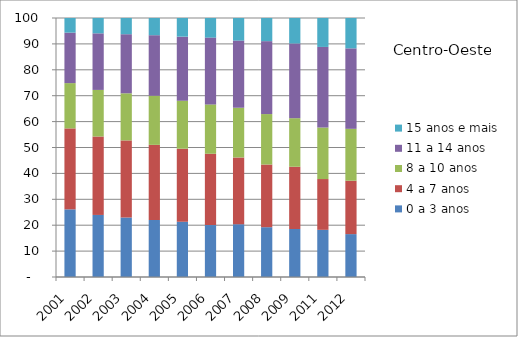
| Category | 0 a 3 anos | 4 a 7 anos | 8 a 10 anos | 11 a 14 anos | 15 anos e mais |
|---|---|---|---|---|---|
| 2001.0 | 26.12 | 31.26 | 17.48 | 19.49 | 5.65 |
| 2002.0 | 23.96 | 30.29 | 17.98 | 21.85 | 5.92 |
| 2003.0 | 22.97 | 29.77 | 18.19 | 22.81 | 6.27 |
| 2004.0 | 22 | 29.02 | 18.97 | 23.37 | 6.64 |
| 2005.0 | 21.35 | 28.19 | 18.55 | 24.7 | 7.21 |
| 2006.0 | 20.05 | 27.53 | 19.06 | 25.79 | 7.57 |
| 2007.0 | 20.39 | 25.78 | 19.15 | 25.96 | 8.72 |
| 2008.0 | 19.23 | 24.2 | 19.48 | 28.15 | 8.94 |
| 2009.0 | 18.53 | 24.04 | 18.75 | 28.84 | 9.84 |
| 2011.0 | 18.21 | 19.61 | 19.89 | 31.12 | 11.18 |
| 2012.0 | 16.56 | 20.62 | 20.03 | 31.07 | 11.71 |